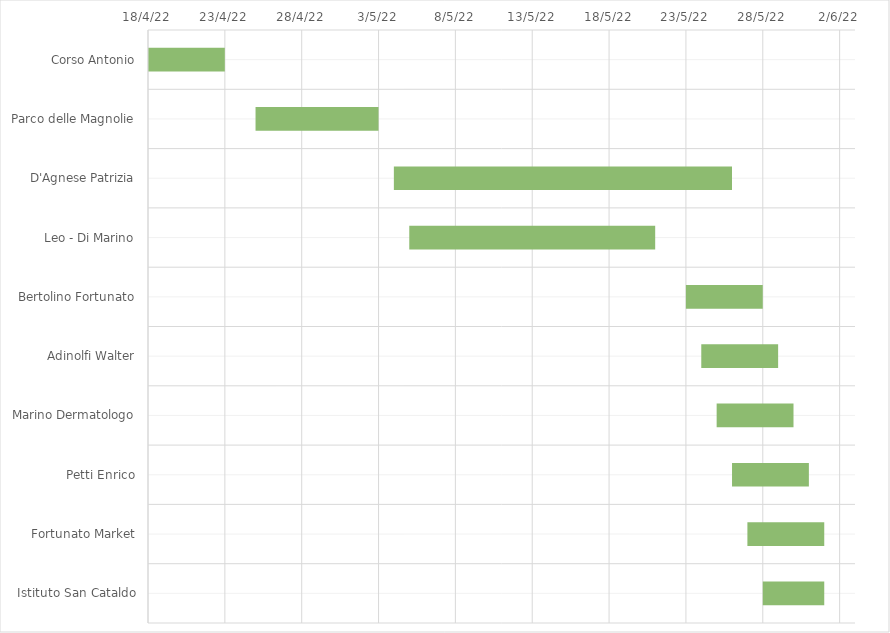
| Category | Series 0 | Series 1 |
|---|---|---|
| Corso Antonio | 4/18/22 | 5 |
| Parco delle Magnolie | 4/25/22 | 8 |
| D'Agnese Patrizia | 5/4/22 | 22 |
| Leo - Di Marino | 5/5/22 | 16 |
| Bertolino Fortunato | 5/23/22 | 5 |
| Adinolfi Walter | 5/24/22 | 5 |
| Marino Dermatologo | 5/25/22 | 5 |
| Petti Enrico | 5/26/22 | 5 |
| Fortunato Market | 5/27/22 | 5 |
| Istituto San Cataldo | 5/28/22 | 4 |